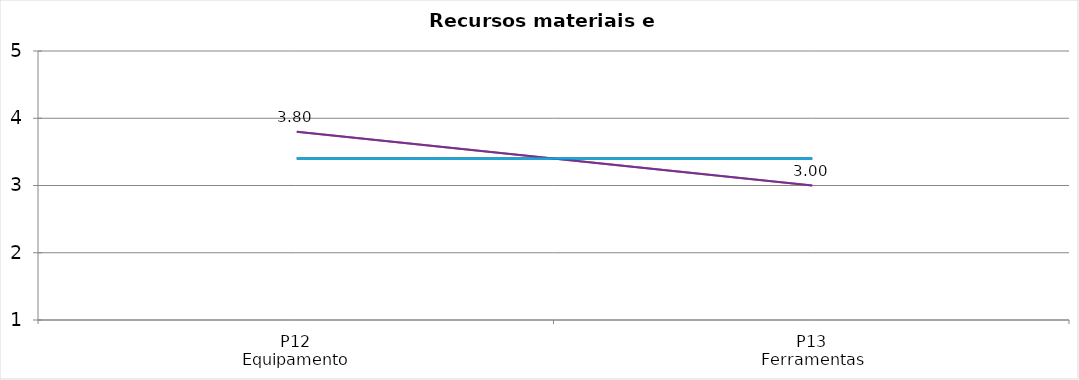
| Category | Valoración (1-5) | MEDIA |
|---|---|---|
| P12
Equipamento | 3.8 | 3.4 |
| P13
Ferramentas | 3 | 3.4 |